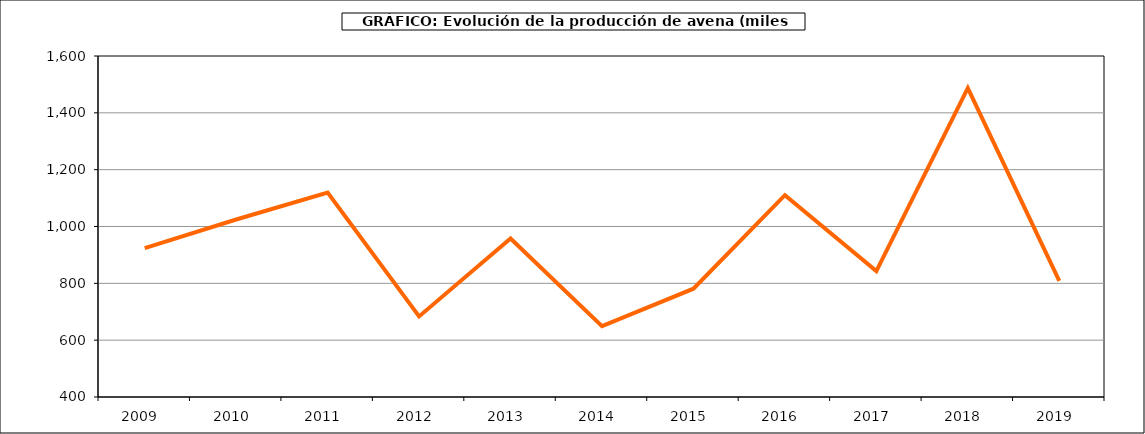
| Category | Superficie |
|---|---|
| 2009.0 | 923.946 |
| 2010.0 | 1024.661 |
| 2011.0 | 1119.214 |
| 2012.0 | 683.482 |
| 2013.0 | 957.662 |
| 2014.0 | 649.194 |
| 2015.0 | 781.048 |
| 2016.0 | 1110.117 |
| 2017.0 | 843.259 |
| 2018.0 | 1486.948 |
| 2019.0 | 808.306 |